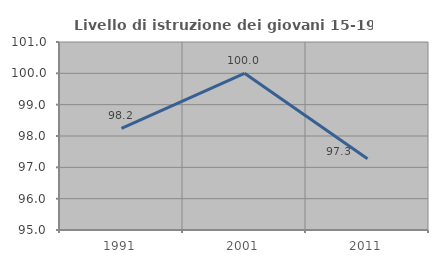
| Category | Livello di istruzione dei giovani 15-19 anni |
|---|---|
| 1991.0 | 98.246 |
| 2001.0 | 100 |
| 2011.0 | 97.273 |